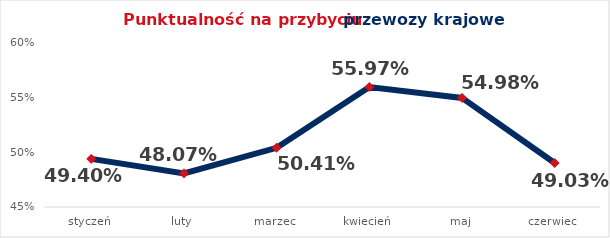
| Category | Series 0 |
|---|---|
| styczeń | 0.494 |
| luty | 0.481 |
| marzec | 0.504 |
| kwiecień | 0.56 |
| maj | 0.55 |
| czerwiec | 0.49 |